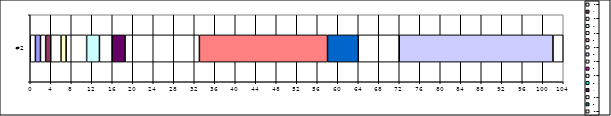
| Category | IDLE1 | A | IDLE2 | H | IDLE3 | F | IDLE4 | D | IDLE5 | B | IDLE6 | O | K | IDLE7 | T | IDLE8 |
|---|---|---|---|---|---|---|---|---|---|---|---|---|---|---|---|---|
| #2 | 1 | 1 | 1 | 1 | 2 | 1 | 4 | 2.5 | 2.5 | 2.5 | 14.5 | 25 | 6 | 8 | 30 | 2 |